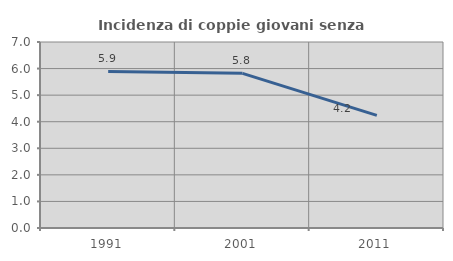
| Category | Incidenza di coppie giovani senza figli |
|---|---|
| 1991.0 | 5.891 |
| 2001.0 | 5.82 |
| 2011.0 | 4.239 |